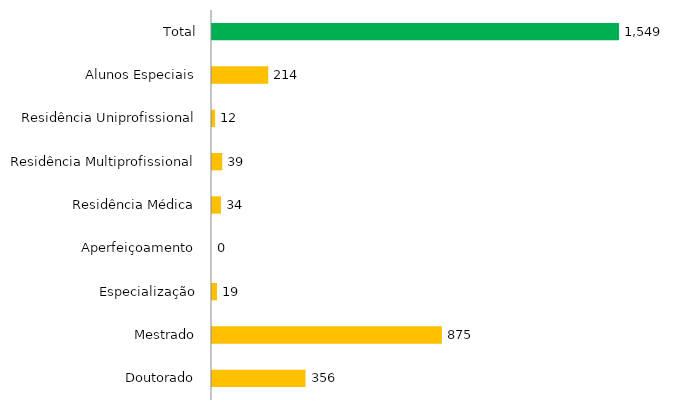
| Category | Pós - Graduação UFGD |
|---|---|
| Doutorado | 356 |
| Mestrado | 875 |
| Especialização | 19 |
| Aperfeiçoamento | 0 |
| Residência Médica | 34 |
| Residência Multiprofissional | 39 |
| Residência Uniprofissional | 12 |
| Alunos Especiais | 214 |
| Total | 1549 |